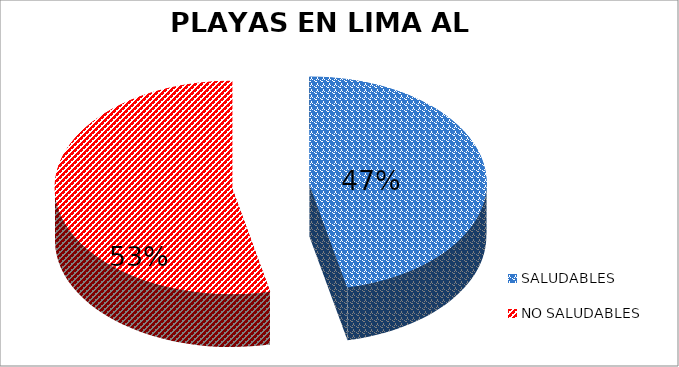
| Category | N.° |
|---|---|
| SALUDABLES | 54 |
| NO SALUDABLES | 62 |